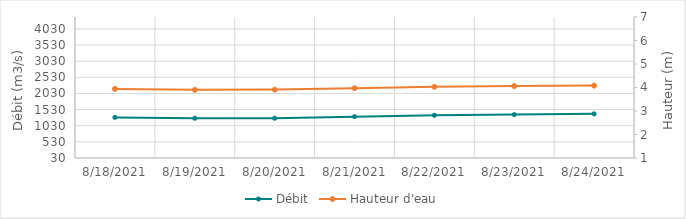
| Category | Débit |
|---|---|
| 6/6/21 | 4147.07 |
| 6/5/21 | 4234.87 |
| 6/4/21 | 4219.22 |
| 6/3/21 | 3876.08 |
| 6/2/21 | 3561.24 |
| 6/1/21 | 3512.96 |
| 5/31/21 | 3456.77 |